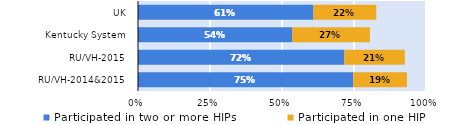
| Category | Participated in two or more HIPs | Participated in one HIP |
|---|---|---|
| RU/VH-2014&2015 | 0.747 | 0.186 |
| RU/VH-2015 | 0.716 | 0.211 |
| Kentucky System | 0.535 | 0.27 |
| UK | 0.609 | 0.218 |